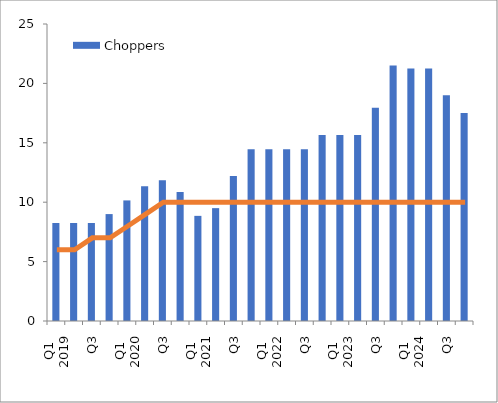
| Category | Choppers |
|---|---|
| 0 | 8.25 |
| 1 | 8.25 |
| 2 | 8.25 |
| 3 | 9 |
| 4 | 10.15 |
| 5 | 11.35 |
| 6 | 11.85 |
| 7 | 10.85 |
| 8 | 8.85 |
| 9 | 9.5 |
| 10 | 12.2 |
| 11 | 14.45 |
| 12 | 14.45 |
| 13 | 14.45 |
| 14 | 14.45 |
| 15 | 15.65 |
| 16 | 15.65 |
| 17 | 15.65 |
| 18 | 17.95 |
| 19 | 21.5 |
| 20 | 21.25 |
| 21 | 21.25 |
| 22 | 19 |
| 23 | 17.5 |